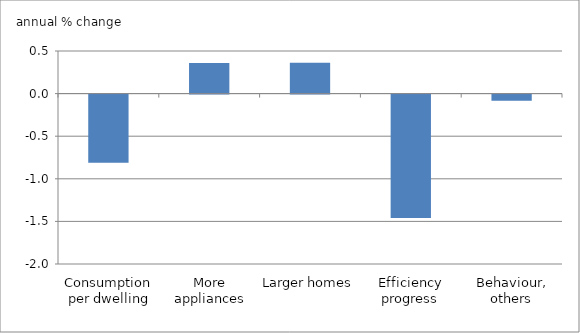
| Category | 1990-2009 |
|---|---|
| Consumption per dwelling | -0.801 |
| More appliances | 0.359 |
| Larger homes | 0.361 |
| Efficiency progress | -1.45 |
| Behaviour, others | -0.071 |